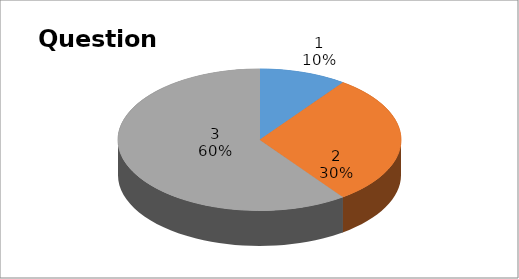
| Category | Series 0 |
|---|---|
| 0 | 1 |
| 1 | 3 |
| 2 | 6 |